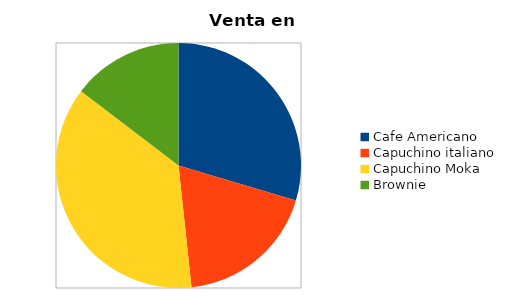
| Category | Series 0 |
|---|---|
| Cafe Americano | 182.143 |
| Capuchino italiano | 115 |
| Capuchino Moka | 228 |
| Brownie | 90 |